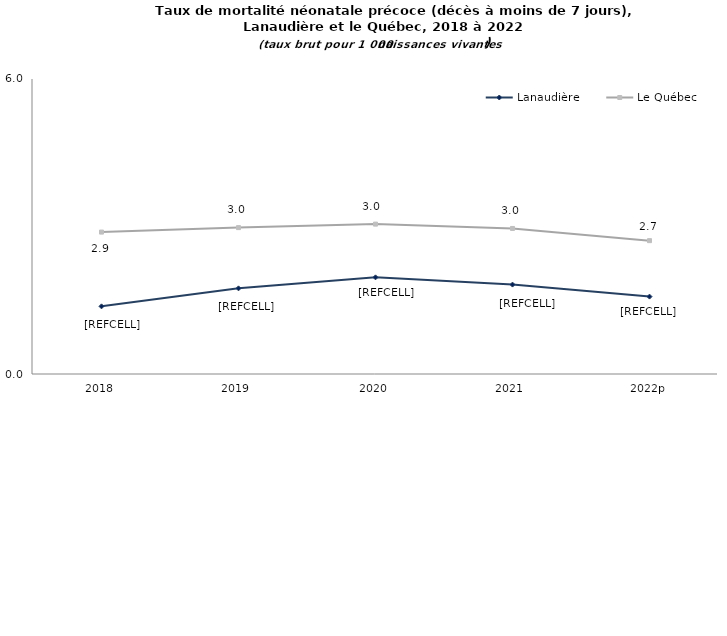
| Category | Lanaudière | Le Québec |
|---|---|---|
| 2018 | 1.376 | 2.886 |
| 2019 | 1.742 | 2.977 |
| 2020 | 1.966 | 3.049 |
| 2021 | 1.819 | 2.96 |
| 2022p | 1.574 | 2.712 |